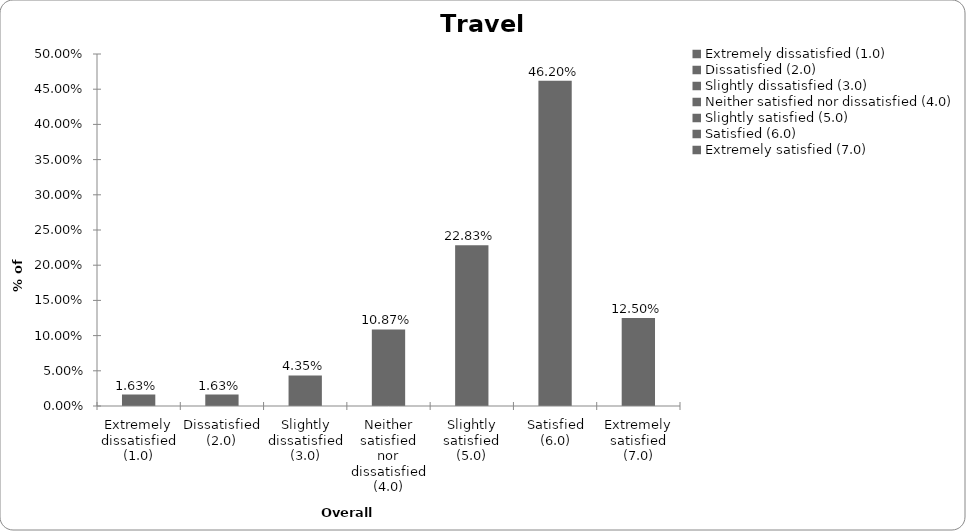
| Category | Series 0 |
|---|---|
| Extremely dissatisfied (1.0) | 0.016 |
| Dissatisfied (2.0) | 0.016 |
| Slightly dissatisfied (3.0) | 0.043 |
| Neither satisfied nor dissatisfied (4.0) | 0.109 |
| Slightly satisfied (5.0) | 0.228 |
| Satisfied (6.0) | 0.462 |
| Extremely satisfied (7.0) | 0.125 |